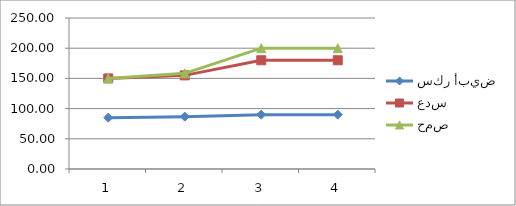
| Category | سكر أبيض | عدس | حمص |
|---|---|---|---|
| 0 | 85 | 150 | 150 |
| 1 | 86.667 | 155 | 158.333 |
| 2 | 90 | 180 | 200 |
| 3 | 90 | 180 | 200 |